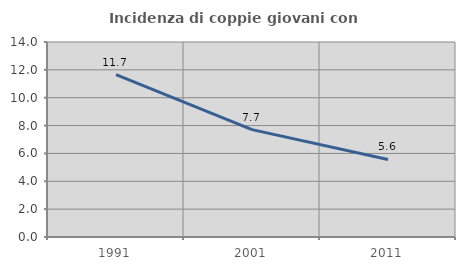
| Category | Incidenza di coppie giovani con figli |
|---|---|
| 1991.0 | 11.659 |
| 2001.0 | 7.707 |
| 2011.0 | 5.569 |